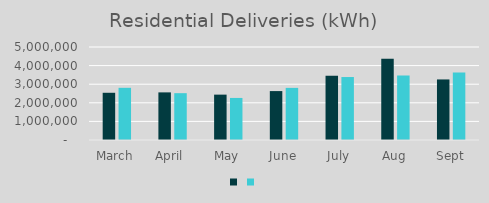
| Category | Series 1 | Series 0 |
|---|---|---|
| March | 2538769 | 2805250 |
| April  | 2560197 | 2517652 |
| May | 2439036 | 2261207 |
| June | 2629934 | 2802052 |
| July | 3456641 | 3385366 |
| Aug | 4364840 | 3470448 |
| Sept | 3255766 | 3631455 |